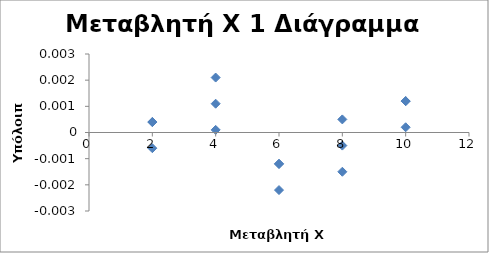
| Category | Series 0 |
|---|---|
| 2.0 | 0 |
| 2.0 | -0.001 |
| 2.0 | 0 |
| 4.0 | 0.001 |
| 4.0 | 0.002 |
| 4.0 | 0 |
| 6.0 | -0.001 |
| 6.0 | -0.001 |
| 6.0 | -0.002 |
| 8.0 | -0.001 |
| 8.0 | 0 |
| 8.0 | -0.002 |
| 10.0 | 0.001 |
| 10.0 | 0 |
| 10.0 | 0.001 |